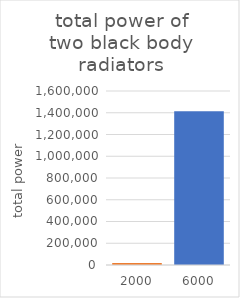
| Category | Series 0 |
|---|---|
| 2000.0 | 18100.049 |
| 6000.0 | 1414078.913 |